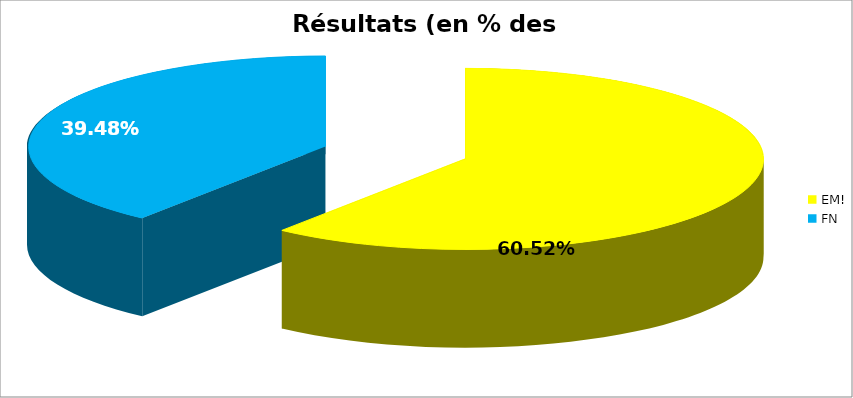
| Category | Résultats |
|---|---|
| EM! | 0.605 |
| FN | 0.395 |